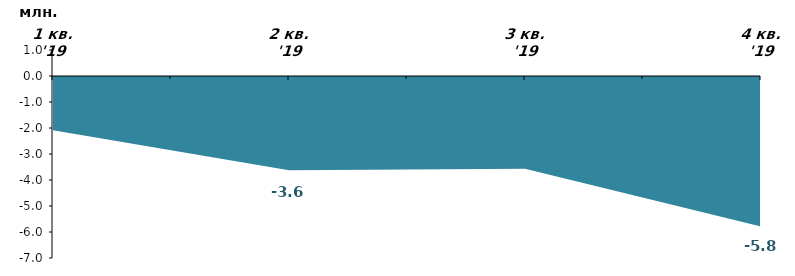
| Category | Наростаючим підсумком |
|---|---|
| 1 кв. '19 | -2.084 |
| 2 кв. '19 | -3.621 |
| 3 кв. '19 | -3.57 |
| 4 кв. '19 | -5.787 |